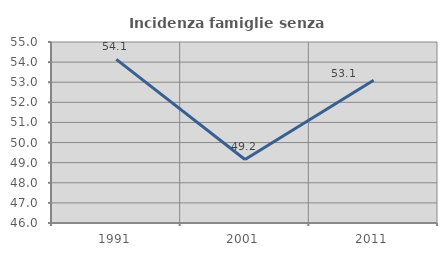
| Category | Incidenza famiglie senza nuclei |
|---|---|
| 1991.0 | 54.135 |
| 2001.0 | 49.16 |
| 2011.0 | 53.101 |